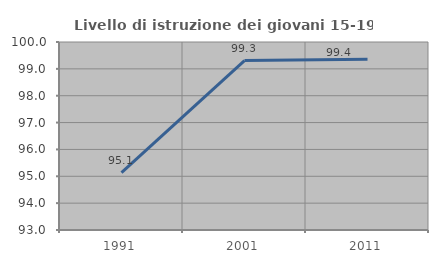
| Category | Livello di istruzione dei giovani 15-19 anni |
|---|---|
| 1991.0 | 95.135 |
| 2001.0 | 99.31 |
| 2011.0 | 99.359 |